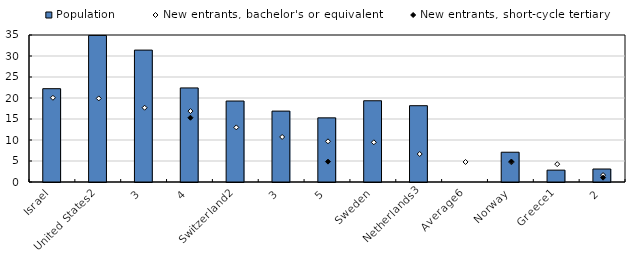
| Category | Population |
|---|---|
| 0 | 22.22 |
| 1 | 34.897 |
| 2 | 31.403 |
| 3 | 22.399 |
| 4 | 19.282 |
| 5 | 16.881 |
| 6 | 15.269 |
| 7 | 19.342 |
| 8 | 18.169 |
| 9 | 0 |
| 10 | 7.087 |
| 11 | 2.827 |
| 12 | 3.093 |